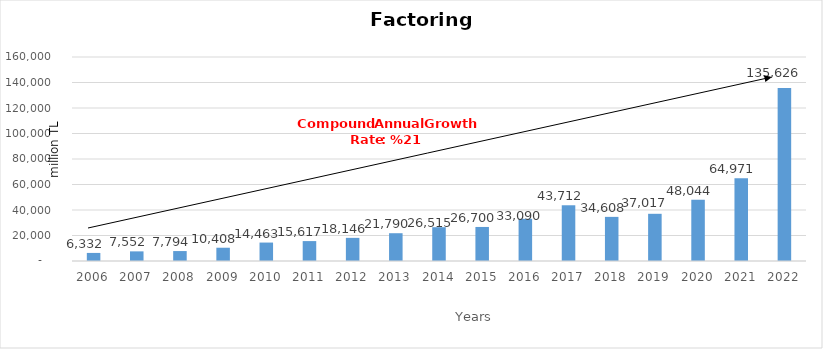
| Category | Factoring |
|---|---|
| 2006.0 | 6331.998 |
| 2007.0 | 7552.18 |
| 2008.0 | 7794.497 |
| 2009.0 | 10407.622 |
| 2010.0 | 14462.609 |
| 2011.0 | 15617.092 |
| 2012.0 | 18146.479 |
| 2013.0 | 21790.367 |
| 2014.0 | 26515 |
| 2015.0 | 26700 |
| 2016.0 | 33090 |
| 2017.0 | 43712 |
| 2018.0 | 34608 |
| 2019.0 | 37017 |
| 2020.0 | 48044 |
| 2021.0 | 64971 |
| 2022.0 | 135626 |